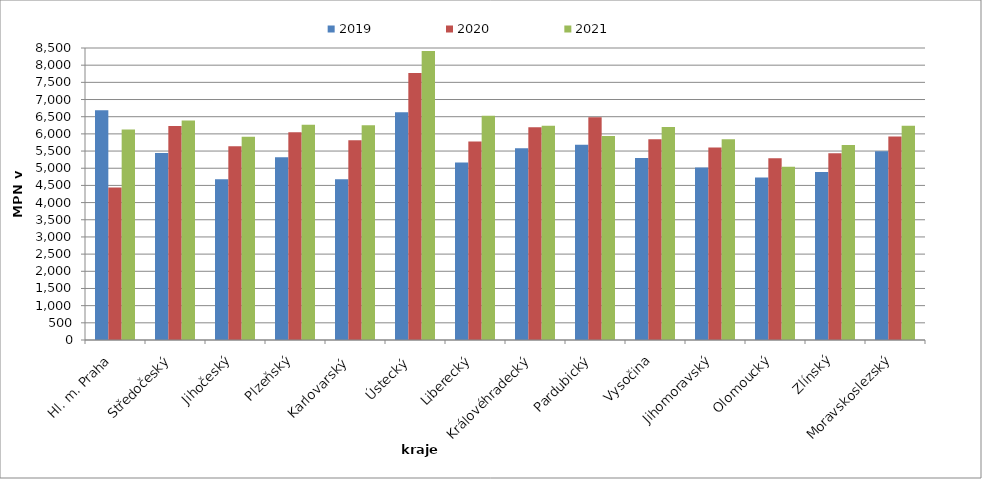
| Category | 2019 | 2020 | 2021 |
|---|---|---|---|
| Hl. m. Praha | 6690 | 4442 | 6128.744 |
| Středočeský | 5441 | 6233 | 6390.642 |
| Jihočeský | 4677 | 5643 | 5918.711 |
| Plzeňský | 5319 | 6048 | 6267.245 |
| Karlovarský  | 4681 | 5813 | 6250.221 |
| Ústecký   | 6632 | 7775 | 8411.933 |
| Liberecký | 5170 | 5779 | 6527.903 |
| Královéhradecký | 5582 | 6195 | 6235.589 |
| Pardubický | 5687 | 6482 | 5935.728 |
| Vysočina | 5298 | 5846 | 6203.679 |
| Jihomoravský | 5023 | 5602 | 5844.843 |
| Olomoucký | 4731 | 5290 | 5045.711 |
| Zlínský | 4888 | 5436 | 5675.108 |
| Moravskoslezský | 5497 | 5923 | 6239.604 |